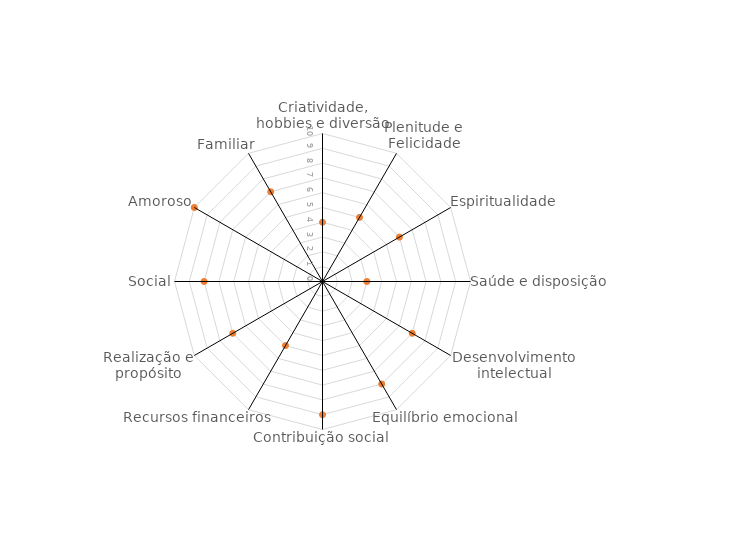
| Category | Series 0 |
|---|---|
| Criatividade, hobbies e diversão | 4 |
| Plenitude e Felicidade | 5 |
| Espiritualidade | 6 |
| Saúde e disposição | 3 |
| Desenvolvimento intelectual | 7 |
| Equilíbrio emocional | 8 |
| Contribuição social | 9 |
| Recursos financeiros | 5 |
| Realização e propósito | 7 |
| Social | 8 |
| Amoroso | 10 |
| Familiar | 7 |